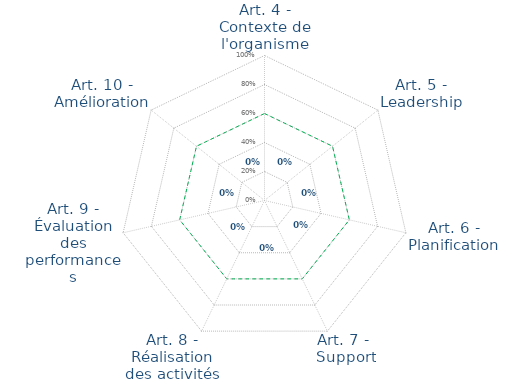
| Category | 60% | Eval Détaillée |
|---|---|---|
| Art. 4 - Contexte de l'organisme | 0.6 | 0 |
| Art. 5 - Leadership | 0.6 | 0 |
| Art. 6 - Planification | 0.6 | 0 |
| Art. 7 -  Support | 0.6 | 0 |
| Art. 8 - Réalisation des activités opérationnelles | 0.6 | 0 |
| Art. 9 - Évaluation des performances | 0.6 | 0 |
| Art. 10 - Amélioration | 0.6 | 0 |